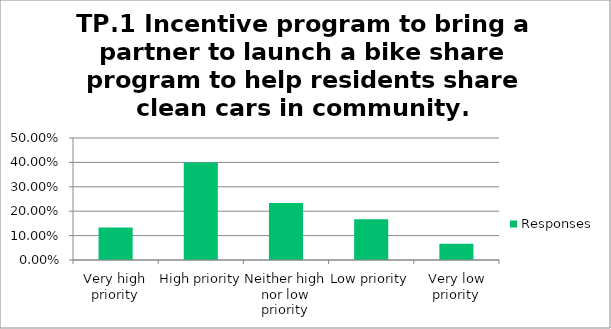
| Category | Responses |
|---|---|
| Very high priority | 0.133 |
| High priority | 0.4 |
| Neither high nor low priority | 0.233 |
| Low priority | 0.167 |
| Very low priority | 0.067 |